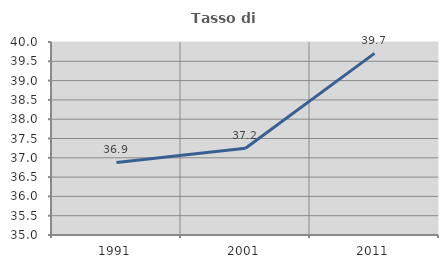
| Category | Tasso di occupazione   |
|---|---|
| 1991.0 | 36.88 |
| 2001.0 | 37.246 |
| 2011.0 | 39.706 |